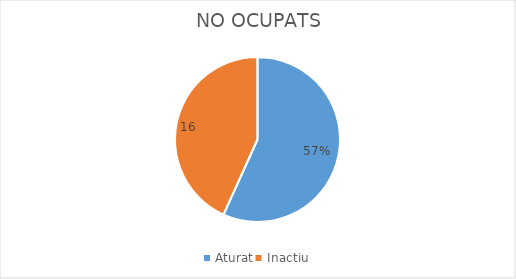
| Category | Series 0 |
|---|---|
| Aturat | 21 |
| Inactiu | 16 |